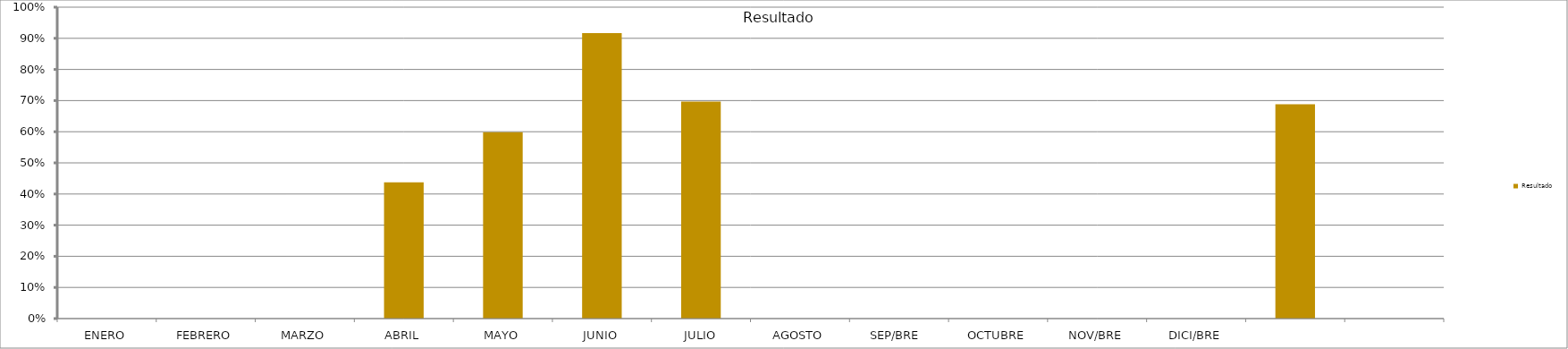
| Category | Resultado  |
|---|---|
| ENERO | 0 |
| FEBRERO | 0 |
| MARZO | 0 |
| ABRIL | 0.437 |
| MAYO | 0.599 |
| JUNIO | 0.917 |
| JULIO | 0.697 |
| AGOSTO | 0 |
| SEP/BRE  | 0 |
| OCTUBRE | 0 |
| NOV/BRE | 0 |
| DICI/BRE | 0 |